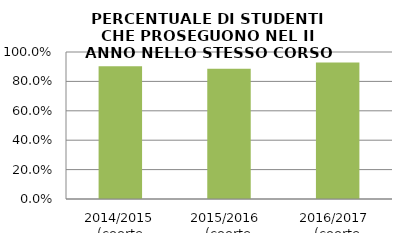
| Category | 2014/2015 (coorte 2013/14) 2015/2016  (coorte 2014/15) 2016/2017  (coorte 2015/16) |
|---|---|
| 2014/2015 (coorte 2013/14) | 0.904 |
| 2015/2016  (coorte 2014/15) | 0.886 |
| 2016/2017  (coorte 2015/16) | 0.929 |